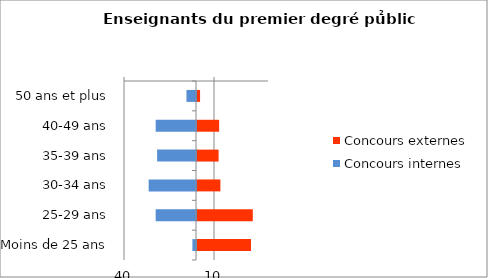
| Category | Concours externes | Concours internes |
|---|---|---|
| 50 ans et plus | 1.7 | -5.3 |
| 40-49 ans | 12.3 | -22.4 |
| 35-39 ans | 12 | -21.6 |
| 30-34 ans | 13 | -26.3 |
| 25-29 ans | 31 | -22.4 |
| Moins de 25 ans | 30 | -2 |